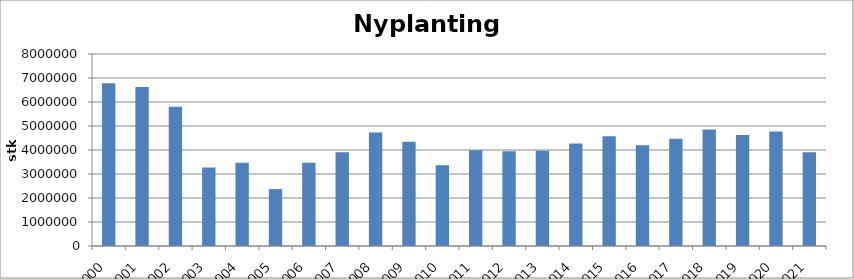
| Category | Totalt |
|---|---|
| 2000 | 6776969 |
| 2001 | 6622134 |
| 2002 | 5801712 |
| 2003 | 3271556 |
| 2004 | 3469386 |
| 2005 | 2370166 |
| 2006 | 3473699 |
| 2007 | 3902957 |
| 2008 | 4727511 |
| 2009 | 4345382 |
| 2010 | 3362757 |
| 2011 | 3984574 |
| 2012 | 3946714 |
| 2013 | 3968517 |
| 2014 | 4270889 |
| 2015 | 4574547 |
| 2016 | 4200212 |
| 2017 | 4468082 |
| 2018 | 4854955 |
| 2019 | 4623285 |
| 2020 | 4770709 |
| 2021 | 3901331 |